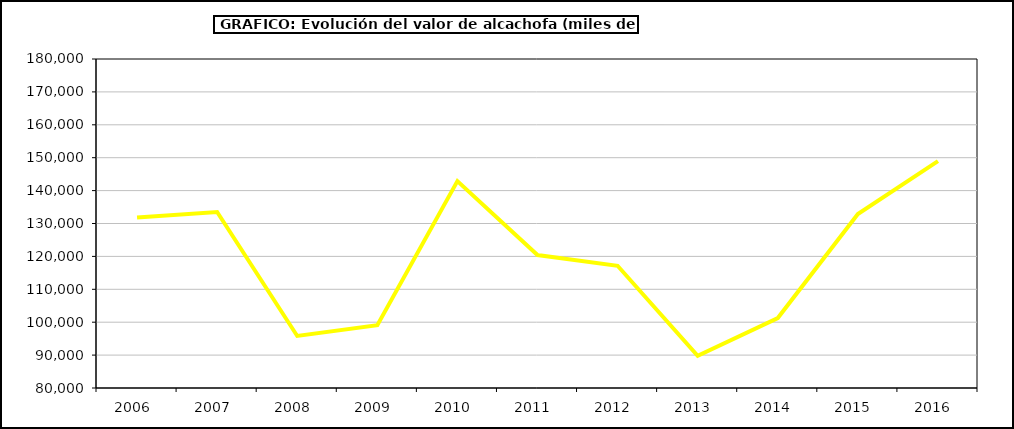
| Category | Valor |
|---|---|
| 2006.0 | 131796.472 |
| 2007.0 | 133505.79 |
| 2008.0 | 95815.761 |
| 2009.0 | 99068.13 |
| 2010.0 | 142879.333 |
| 2011.0 | 120418 |
| 2012.0 | 117146.597 |
| 2013.0 | 89795.299 |
| 2014.0 | 101254.898 |
| 2015.0 | 132897 |
| 2016.0 | 148974 |